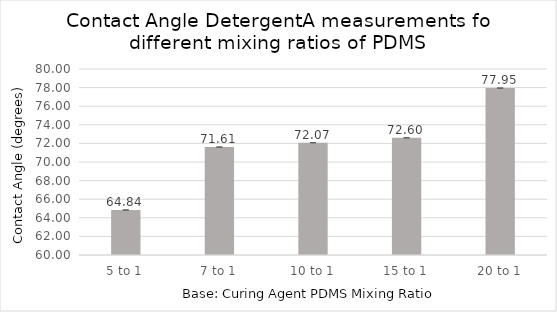
| Category | Series 0 |
|---|---|
| 5 to 1 | 64.84 |
| 7 to 1 | 71.607 |
| 10 to 1 | 72.07 |
| 15 to 1 | 72.603 |
| 20 to 1 | 77.95 |